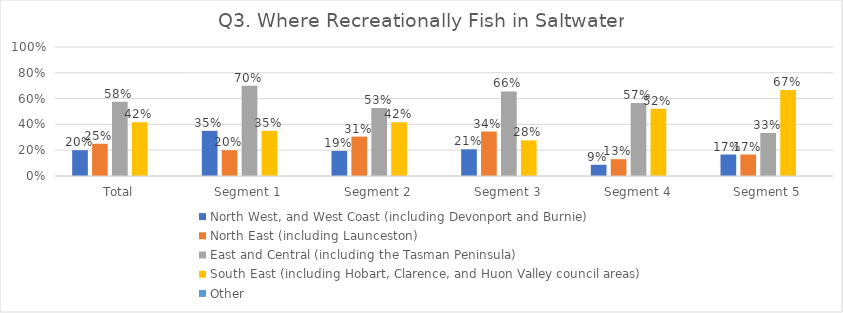
| Category | North West, and West Coast (including Devonport and Burnie) | North East (including Launceston) | East and Central (including the Tasman Peninsula) | South East (including Hobart, Clarence, and Huon Valley council areas) | Other |
|---|---|---|---|---|---|
| Total | 0.2 | 0.25 | 0.575 | 0.417 | 0 |
| Segment 1 | 0.35 | 0.2 | 0.7 | 0.35 | 0 |
| Segment 2 | 0.194 | 0.306 | 0.528 | 0.417 | 0 |
| Segment 3 | 0.207 | 0.345 | 0.655 | 0.276 | 0 |
| Segment 4 | 0.087 | 0.13 | 0.565 | 0.522 | 0 |
| Segment 5 | 0.167 | 0.167 | 0.333 | 0.667 | 0 |